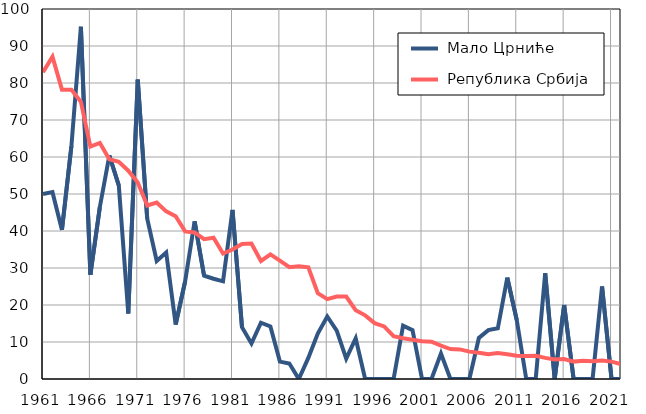
| Category |  Мало Црниће |  Република Србија |
|---|---|---|
| 1961.0 | 50 | 82.9 |
| 1962.0 | 50.5 | 87.1 |
| 1963.0 | 40.3 | 78.2 |
| 1964.0 | 63 | 78.2 |
| 1965.0 | 95.2 | 74.9 |
| 1966.0 | 28.2 | 62.8 |
| 1967.0 | 46.5 | 63.8 |
| 1968.0 | 60.4 | 59.4 |
| 1969.0 | 52.3 | 58.7 |
| 1970.0 | 17.7 | 56.3 |
| 1971.0 | 80.9 | 53.1 |
| 1972.0 | 43.3 | 46.9 |
| 1973.0 | 31.9 | 47.7 |
| 1974.0 | 34.2 | 45.3 |
| 1975.0 | 14.7 | 44 |
| 1976.0 | 26.4 | 39.9 |
| 1977.0 | 42.6 | 39.6 |
| 1978.0 | 27.9 | 37.8 |
| 1979.0 | 27.1 | 38.2 |
| 1980.0 | 26.4 | 33.9 |
| 1981.0 | 45.7 | 35 |
| 1982.0 | 14 | 36.5 |
| 1983.0 | 9.6 | 36.6 |
| 1984.0 | 15.2 | 31.9 |
| 1985.0 | 14.2 | 33.7 |
| 1986.0 | 4.7 | 32 |
| 1987.0 | 4.2 | 30.2 |
| 1988.0 | 0 | 30.5 |
| 1989.0 | 5.7 | 30.2 |
| 1990.0 | 12.3 | 23.2 |
| 1991.0 | 16.9 | 21.6 |
| 1992.0 | 13.1 | 22.3 |
| 1993.0 | 5.5 | 22.3 |
| 1994.0 | 11 | 18.6 |
| 1995.0 | 0 | 17.2 |
| 1996.0 | 0 | 15.1 |
| 1997.0 | 0 | 14.2 |
| 1998.0 | 0 | 11.6 |
| 1999.0 | 14.4 | 11 |
| 2000.0 | 13.2 | 10.6 |
| 2001.0 | 0 | 10.2 |
| 2002.0 | 0 | 10.1 |
| 2003.0 | 6.9 | 9 |
| 2004.0 | 0 | 8.1 |
| 2005.0 | 0 | 8 |
| 2006.0 | 0 | 7.4 |
| 2007.0 | 11.1 | 7.1 |
| 2008.0 | 13.2 | 6.7 |
| 2009.0 | 13.7 | 7 |
| 2010.0 | 27.4 | 6.7 |
| 2011.0 | 15.9 | 6.3 |
| 2012.0 | 0 | 6.2 |
| 2013.0 | 0 | 6.3 |
| 2014.0 | 28.6 | 5.7 |
| 2015.0 | 0 | 5.3 |
| 2016.0 | 20 | 5.4 |
| 2017.0 | 0 | 4.7 |
| 2018.0 | 0 | 4.9 |
| 2019.0 | 0 | 4.8 |
| 2020.0 | 25 | 5 |
| 2021.0 | 0 | 4.7 |
| 2022.0 | 0 | 4 |